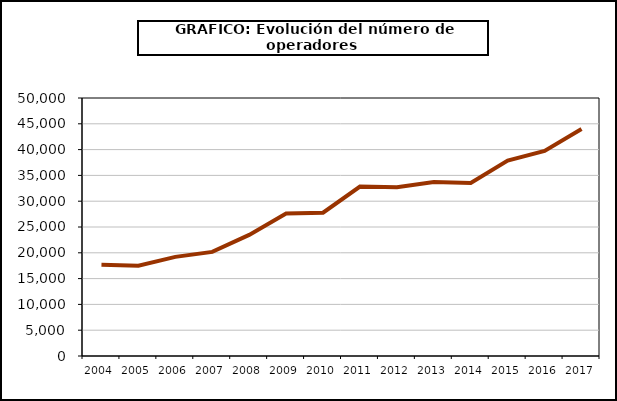
| Category | Operadores (*) |
|---|---|
| 2004.0 | 17688 |
| 2005.0 | 17509 |
| 2006.0 | 19211 |
| 2007.0 | 20171 |
| 2008.0 | 23473 |
| 2009.0 | 27627 |
| 2010.0 | 27767 |
| 2011.0 | 32837 |
| 2012.0 | 32724 |
| 2013.0 | 33704 |
| 2014.0 | 33539 |
| 2015.0 | 37870 |
| 2016.0 | 39744 |
| 2017.0 | 43984 |